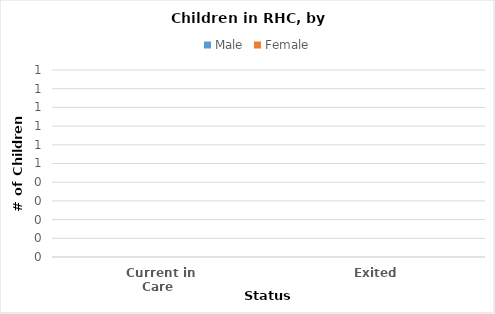
| Category | Male | Female |
|---|---|---|
| Current in Care  | 0 | 0 |
| Exited | 0 | 0 |